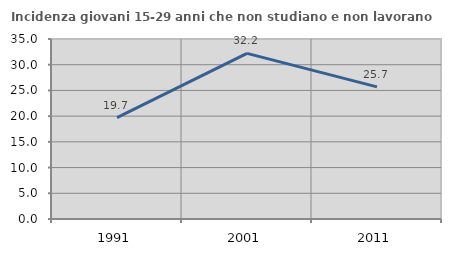
| Category | Incidenza giovani 15-29 anni che non studiano e non lavorano  |
|---|---|
| 1991.0 | 19.712 |
| 2001.0 | 32.213 |
| 2011.0 | 25.687 |